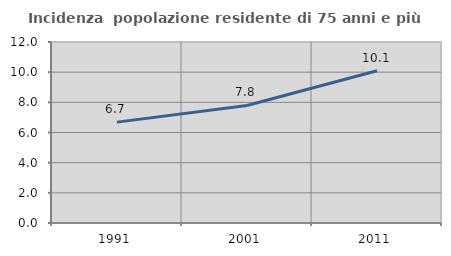
| Category | Incidenza  popolazione residente di 75 anni e più |
|---|---|
| 1991.0 | 6.688 |
| 2001.0 | 7.792 |
| 2011.0 | 10.092 |